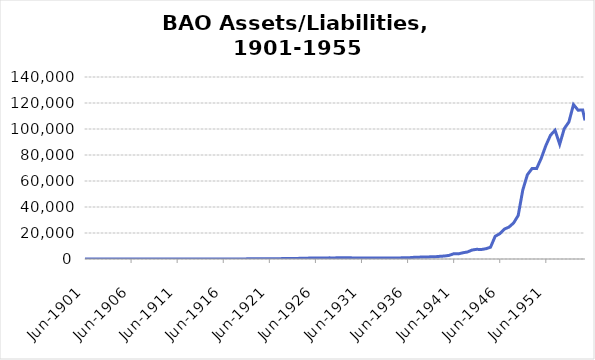
| Category | Series 0 |
|---|---|
| 1901-06-30 | 4347423.24 |
| 1901-12-31 | 5701801.87 |
| 1902-06-30 | 5460901.55 |
| 1902-12-31 | 6920376.16 |
| 1903-06-30 | 8138809.36 |
| 1903-12-31 | 7381254.11 |
| 1904-06-30 | 14180345.92 |
| 1904-12-31 | 14327951.69 |
| 1905-06-30 | 17002626.83 |
| 1905-12-31 | 15297768.24 |
| 1906-06-30 | 17615794.88 |
| 1906-12-31 | 16979536.36 |
| 1907-06-30 | 18381144.19 |
| 1907-12-31 | 19302410.73 |
| 1908-06-30 | 20133977.7 |
| 1908-12-31 | 18933944.17 |
| 1909-06-30 | 24284097 |
| 1909-12-31 | 28400846.69 |
| 1910-06-30 | 28297910.31 |
| 1910-12-31 | 28751207.71 |
| 1911-06-30 | 31184663.47 |
| 1911-12-31 | 26369824.47 |
| 1912-06-30 | 29372761.04 |
| 1912-12-31 | 28837219.37 |
| 1913-06-30 | 31783749.7 |
| 1913-12-31 | 31740690.29 |
| 1914-06-30 | 35888230.38 |
| 1914-12-31 | 30907130.49 |
| 1915-06-30 | 34930676.4 |
| 1915-12-31 | 39093168.69 |
| 1916-06-30 | 42729408.95 |
| 1916-12-31 | 44655643.8 |
| 1917-06-30 | 50157286.07 |
| 1917-12-31 | 61230954.44 |
| 1918-06-30 | 75609517.02 |
| 1918-12-31 | 96079346.49 |
| 1919-06-30 | 119604437.69 |
| 1919-12-31 | 188627129.17 |
| 1920-06-30 | 245568948.68 |
| 1920-12-31 | 255318210.12 |
| 1921-06-30 | 223939004.66 |
| 1921-12-31 | 265998252.59 |
| 1922-06-30 | 240257778.75 |
| 1922-12-31 | 319711208.13 |
| 1923-06-30 | 328044432.19 |
| 1923-12-31 | 470540181.49 |
| 1924-06-30 | 440120599.58 |
| 1924-12-31 | 564502137.2 |
| 1925-06-30 | 539677477.88 |
| 1925-12-31 | 824573455.46 |
| 1926-06-30 | 735535726.42 |
| 1926-12-31 | 812045960.24 |
| 1927-06-30 | 722893858.94 |
| 1927-12-31 | 875375086.93 |
| 1928-06-30 | 819121632.82 |
| 1928-12-31 | 949933801.2 |
| 1929-06-30 | 875043764.85 |
| 1929-12-31 | 973051656.99 |
| 1930-06-30 | 853991721.05 |
| 1930-12-31 | 832281346.66 |
| 1931-06-30 | 794312373.18 |
| 1931-12-31 | 863653989.57 |
| 1932-06-30 | 782967983.13 |
| 1932-12-31 | 749175374.85 |
| 1933-06-30 | 733034106.02 |
| 1933-12-31 | 742348484.83 |
| 1934-06-30 | 774007577.17 |
| 1934-12-31 | 825191927.41 |
| 1935-06-30 | 816480596.68 |
| 1935-12-31 | 907351917.9 |
| 1936-06-30 | 867633967 |
| 1936-12-31 | 1187487466.34 |
| 1937-06-30 | 1415857642.38 |
| 1937-12-31 | 1453085549.88 |
| 1938-06-30 | 1450431426.33 |
| 1938-12-31 | 1718294952.52 |
| 1939-06-30 | 1730426176.4 |
| 1939-12-31 | 2046888972.84 |
| 1940-06-30 | 2293152591.03 |
| 1940-12-31 | 2769011642.25 |
| 1941-06-30 | 4023438522.9 |
| 1941-12-31 | 3937998843.9 |
| 1942-06-30 | 4785153233.11 |
| 1942-12-31 | 5411696621.32 |
| 1943-06-30 | 6902128455.54 |
| 1943-12-31 | 7446675694.13 |
| 1944-06-30 | 7278378034.56 |
| 1944-12-31 | 7921794232.31 |
| 1945-06-30 | 9058976198.25 |
| 1945-12-31 | 17475006820.71 |
| 1946-06-30 | 19422114245.93 |
| 1946-12-31 | 23022214619.77 |
| 1947-06-30 | 24544187596.69 |
| 1947-12-31 | 27692885623.59 |
| 1948-06-30 | 33458347122.82 |
| 1948-12-31 | 53163545359.56 |
| 1949-06-30 | 64838388356 |
| 1949-12-31 | 69601236212 |
| 1950-06-30 | 69529958454 |
| 1950-12-31 | 77471708469 |
| 1951-06-30 | 87169625862 |
| 1951-12-31 | 95156629909 |
| 1952-06-30 | 99037220597 |
| 1952-12-31 | 88236363452 |
| 1953-06-30 | 100272322400 |
| 1953-12-31 | 105406253033 |
| 1954-06-30 | 118765426088 |
| 1954-12-31 | 114466788567 |
| 1955-06-30 | 114652712737 |
| 1955-09-30 | 106566313411 |